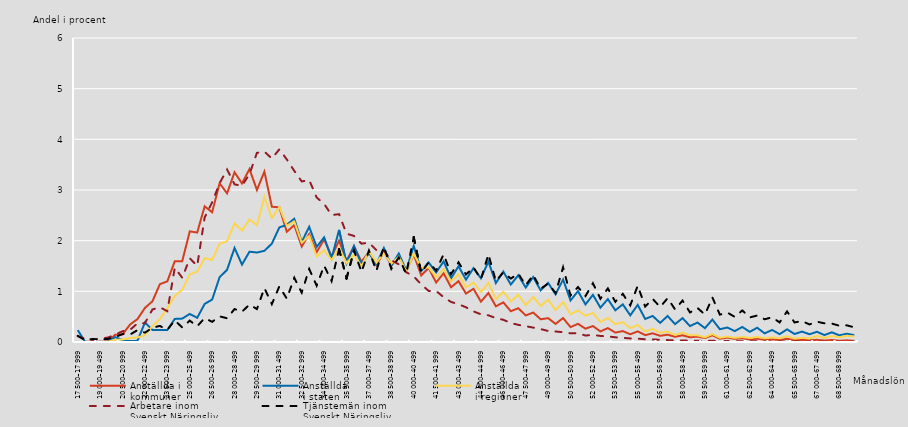
| Category | Anställda i 
kommuner | Anställda 
i staten | Anställda 
i regioner | Arbetare inom 
Svenskt Näringsliv | Tjänstemän inom
Svenskt Näringsliv |
|---|---|---|---|---|---|
| 17 500–17 999 | 0.001 | 0.235 | 0 | 0.116 | 0.121 |
| 18 000–18 499 | 0.002 | 0.001 | 0 | 0.063 | 0.035 |
| 18 500–18 999 | 0.004 | 0 | 0.001 | 0.042 | 0.06 |
| 19 000–19 499 | 0.006 | 0.003 | 0.001 | 0.07 | 0.046 |
| 19 500–19 999 | 0.008 | 0.001 | 0.001 | 0.086 | 0.06 |
| 20 000–20 499 | 0.142 | 0.097 | 0.046 | 0.143 | 0.098 |
| 20 500–20 999 | 0.149 | 0.039 | 0.048 | 0.213 | 0.157 |
| 21 000–21 499 | 0.344 | 0.018 | 0.079 | 0.239 | 0.146 |
| 21 500–21 999 | 0.452 | 0.023 | 0.088 | 0.368 | 0.235 |
| 22 000–22 499 | 0.673 | 0.384 | 0.135 | 0.371 | 0.185 |
| 22 500–22 999 | 0.802 | 0.238 | 0.313 | 0.641 | 0.283 |
| 23 000–23 499 | 1.141 | 0.239 | 0.452 | 0.685 | 0.317 |
| 23 500–23 999 | 1.197 | 0.237 | 0.667 | 0.609 | 0.241 |
| 24 000–24 499 | 1.595 | 0.456 | 0.911 | 1.467 | 0.427 |
| 24 500–24 999 | 1.595 | 0.462 | 1.032 | 1.266 | 0.286 |
| 25 000–25 499 | 2.184 | 0.554 | 1.334 | 1.653 | 0.422 |
| 25 500–25 999 | 2.16 | 0.477 | 1.389 | 1.502 | 0.31 |
| 26 000–26 499 | 2.678 | 0.752 | 1.657 | 2.459 | 0.473 |
| 26 500–26 999 | 2.561 | 0.837 | 1.618 | 2.756 | 0.398 |
| 27 000–27 499 | 3.132 | 1.279 | 1.94 | 3.134 | 0.506 |
| 27 500–27 999 | 2.934 | 1.424 | 1.988 | 3.405 | 0.468 |
| 28 000–28 499 | 3.351 | 1.856 | 2.339 | 3.111 | 0.65 |
| 28 500–28 999 | 3.13 | 1.528 | 2.2 | 3.084 | 0.597 |
| 29 000–29 499 | 3.414 | 1.782 | 2.422 | 3.312 | 0.74 |
| 29 500–29 999 | 3.002 | 1.766 | 2.303 | 3.733 | 0.65 |
| 30 000–30 499 | 3.363 | 1.799 | 2.863 | 3.758 | 1.064 |
| 30 500–30 999 | 2.67 | 1.942 | 2.446 | 3.621 | 0.748 |
| 31 000–31 499 | 2.657 | 2.261 | 2.664 | 3.802 | 1.097 |
| 31 500–31 999 | 2.175 | 2.314 | 2.294 | 3.604 | 0.856 |
| 32 000–32 499 | 2.308 | 2.432 | 2.378 | 3.378 | 1.268 |
| 32 500–32 999 | 1.884 | 1.974 | 1.959 | 3.169 | 0.975 |
| 33 000–33 499 | 2.129 | 2.273 | 2.092 | 3.197 | 1.441 |
| 33 500–33 999 | 1.773 | 1.877 | 1.689 | 2.852 | 1.113 |
| 34 000–34 499 | 2.025 | 2.066 | 1.811 | 2.726 | 1.505 |
| 34 500–34 999 | 1.688 | 1.652 | 1.617 | 2.505 | 1.203 |
| 35 000–35 499 | 2.002 | 2.213 | 1.855 | 2.523 | 1.833 |
| 35 500–35 999 | 1.599 | 1.552 | 1.556 | 2.138 | 1.252 |
| 36 000–36 499 | 1.89 | 1.894 | 1.728 | 2.094 | 1.807 |
| 36 500–36 999 | 1.585 | 1.538 | 1.494 | 1.941 | 1.383 |
| 37 000–37 499 | 1.776 | 1.757 | 1.795 | 1.959 | 1.804 |
| 37 500–37 999 | 1.514 | 1.539 | 1.567 | 1.814 | 1.404 |
| 38 000–38 499 | 1.784 | 1.854 | 1.757 | 1.8 | 1.885 |
| 38 500–38 999 | 1.507 | 1.507 | 1.545 | 1.613 | 1.444 |
| 39 000–39 499 | 1.702 | 1.745 | 1.682 | 1.533 | 1.668 |
| 39 500–39 999 | 1.399 | 1.409 | 1.391 | 1.377 | 1.344 |
| 40 000–40 499 | 1.726 | 1.898 | 1.745 | 1.295 | 2.072 |
| 40 500–40 999 | 1.314 | 1.4 | 1.465 | 1.138 | 1.368 |
| 41 000–41 499 | 1.46 | 1.569 | 1.47 | 1.008 | 1.574 |
| 41 500–41 999 | 1.174 | 1.373 | 1.28 | 1.007 | 1.411 |
| 42 000–42 499 | 1.356 | 1.59 | 1.443 | 0.885 | 1.731 |
| 42 500–42 999 | 1.08 | 1.259 | 1.195 | 0.791 | 1.34 |
| 43 000–43 499 | 1.202 | 1.495 | 1.339 | 0.746 | 1.573 |
| 43 500–43 999 | 0.956 | 1.231 | 1.079 | 0.685 | 1.331 |
| 44 000–44 499 | 1.049 | 1.458 | 1.171 | 0.605 | 1.472 |
| 44 500–44 999 | 0.796 | 1.257 | 0.986 | 0.546 | 1.24 |
| 45 000–45 499 | 0.968 | 1.588 | 1.166 | 0.527 | 1.731 |
| 45 500–45 999 | 0.704 | 1.164 | 0.848 | 0.472 | 1.202 |
| 46 000–46 499 | 0.782 | 1.389 | 0.99 | 0.438 | 1.374 |
| 46 500–46 999 | 0.607 | 1.135 | 0.801 | 0.374 | 1.252 |
| 47 000–47 499 | 0.667 | 1.317 | 0.931 | 0.338 | 1.349 |
| 47 500–47 999 | 0.524 | 1.075 | 0.728 | 0.312 | 1.119 |
| 48 000–48 499 | 0.581 | 1.282 | 0.89 | 0.284 | 1.323 |
| 48 500–48 999 | 0.449 | 1.019 | 0.71 | 0.255 | 1.05 |
| 49 000–49 499 | 0.471 | 1.167 | 0.838 | 0.217 | 1.153 |
| 49 500–49 999 | 0.357 | 0.94 | 0.629 | 0.207 | 0.967 |
| 50 000–50 499 | 0.473 | 1.233 | 0.79 | 0.193 | 1.474 |
| 50 500–50 999 | 0.294 | 0.821 | 0.546 | 0.172 | 0.918 |
| 51 000–51 499 | 0.359 | 1.003 | 0.623 | 0.172 | 1.085 |
| 51 500–51 999 | 0.263 | 0.742 | 0.517 | 0.128 | 0.906 |
| 52 000–52 499 | 0.315 | 0.93 | 0.573 | 0.14 | 1.16 |
| 52 500–52 999 | 0.209 | 0.678 | 0.395 | 0.12 | 0.854 |
| 53 000–53 499 | 0.274 | 0.847 | 0.475 | 0.111 | 1.058 |
| 53 500–53 999 | 0.186 | 0.626 | 0.35 | 0.093 | 0.794 |
| 54 000–54 499 | 0.216 | 0.743 | 0.392 | 0.081 | 0.95 |
| 54 500–54 999 | 0.152 | 0.527 | 0.273 | 0.07 | 0.723 |
| 55 000–55 499 | 0.209 | 0.732 | 0.334 | 0.066 | 1.111 |
| 55 500–55 999 | 0.135 | 0.455 | 0.208 | 0.054 | 0.699 |
| 56 000–56 499 | 0.171 | 0.514 | 0.259 | 0.051 | 0.85 |
| 56 500–56 999 | 0.122 | 0.377 | 0.183 | 0.044 | 0.691 |
| 57 000–57 499 | 0.144 | 0.513 | 0.205 | 0.038 | 0.864 |
| 57 500–57 999 | 0.103 | 0.353 | 0.139 | 0.031 | 0.643 |
| 58 000–58 499 | 0.132 | 0.471 | 0.184 | 0.029 | 0.818 |
| 58 500–58 999 | 0.093 | 0.314 | 0.136 | 0.028 | 0.583 |
| 59 000–59 499 | 0.107 | 0.384 | 0.131 | 0.024 | 0.672 |
| 59 500–59 999 | 0.078 | 0.273 | 0.092 | 0.024 | 0.541 |
| 60 000–60 499 | 0.131 | 0.443 | 0.157 | 0.023 | 0.879 |
| 60 500–60 999 | 0.064 | 0.252 | 0.083 | 0.023 | 0.54 |
| 61 000–61 499 | 0.086 | 0.286 | 0.106 | 0.019 | 0.581 |
| 61 500–61 999 | 0.062 | 0.215 | 0.082 | 0.016 | 0.495 |
| 62 000–62 499 | 0.073 | 0.297 | 0.098 | 0.016 | 0.623 |
| 62 500–62 999 | 0.051 | 0.201 | 0.079 | 0.014 | 0.485 |
| 63 000–63 499 | 0.065 | 0.281 | 0.098 | 0.014 | 0.523 |
| 63 500–63 999 | 0.045 | 0.17 | 0.074 | 0.011 | 0.448 |
| 64 000–64 499 | 0.052 | 0.238 | 0.09 | 0.009 | 0.488 |
| 64 500–64 999 | 0.039 | 0.155 | 0.074 | 0.008 | 0.387 |
| 65 000–65 499 | 0.063 | 0.25 | 0.114 | 0.007 | 0.604 |
| 65 500–65 999 | 0.038 | 0.158 | 0.066 | 0.008 | 0.386 |
| 66 000–66 499 | 0.042 | 0.205 | 0.08 | 0.009 | 0.414 |
| 66 500–66 999 | 0.035 | 0.153 | 0.07 | 0.006 | 0.346 |
| 67 000–67 499 | 0.043 | 0.202 | 0.119 | 0.006 | 0.4 |
| 67 500–67 999 | 0.029 | 0.137 | 0.079 | 0.006 | 0.369 |
| 68 000–68 499 | 0.039 | 0.191 | 0.117 | 0.004 | 0.363 |
| 68 500–68 999 | 0.025 | 0.131 | 0.096 | 0.006 | 0.321 |
| 69 000–69 499 | 0.033 | 0.163 | 0.123 | 0.004 | 0.329 |
| 69 500–69 999 | 0.022 | 0.135 | 0.11 | 0.003 | 0.289 |